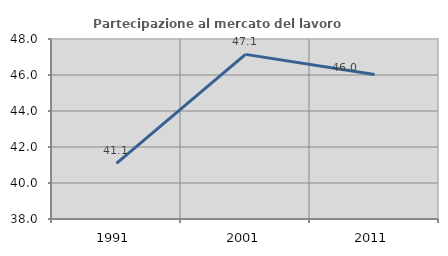
| Category | Partecipazione al mercato del lavoro  femminile |
|---|---|
| 1991.0 | 41.089 |
| 2001.0 | 47.146 |
| 2011.0 | 46.024 |